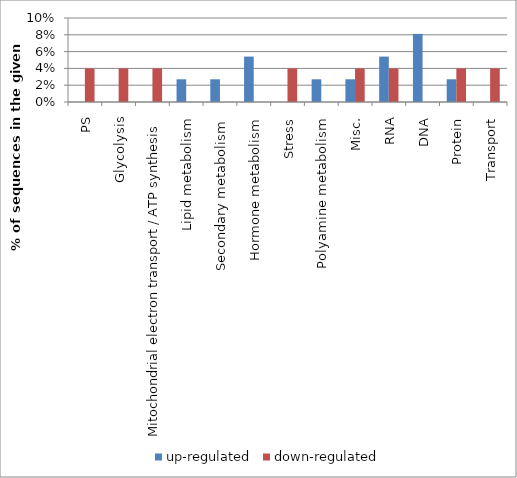
| Category | up-regulated | down-regulated |
|---|---|---|
| PS | 0 | 0.04 |
| Glycolysis | 0 | 0.04 |
| Mitochondrial electron transport / ATP synthesis | 0 | 0.04 |
| Lipid metabolism | 0.027 | 0 |
| Secondary metabolism | 0.027 | 0 |
| Hormone metabolism | 0.054 | 0 |
| Stress | 0 | 0.04 |
| Polyamine metabolism | 0.027 | 0 |
| Misc. | 0.027 | 0.04 |
| RNA | 0.054 | 0.04 |
| DNA | 0.081 | 0 |
| Protein | 0.027 | 0.04 |
| Transport | 0 | 0.04 |